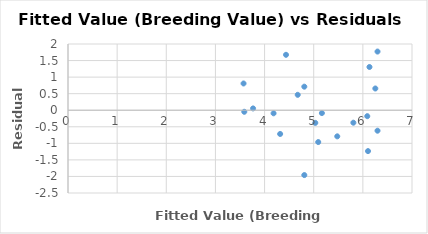
| Category | residual (y-yest) |
|---|---|
| 5.806840272404171 | -0.377 |
| 3.5871606789335626 | -0.047 |
| 4.674654707949363 | 0.465 |
| 4.317122424437319 | -0.717 |
| 6.298447162233232 | 1.772 |
| 6.253755626794225 | 0.656 |
| 5.1662615977784245 | -0.086 |
| 5.0917757053800825 | -0.962 |
| 5.032186991461408 | -0.382 |
| 6.134578198956878 | 1.305 |
| 4.8087293142663805 | -1.959 |
| 4.436299852274668 | 1.674 |
| 4.8087293142663805 | 0.711 |
| 3.5722635004538943 | 0.808 |
| 3.7659268206895846 | 0.054 |
| 6.298447162233232 | -0.618 |
| 5.479102345851464 | -0.789 |
| 4.183047818120303 | -0.093 |
| 6.089886663517873 | -0.18 |
| 6.104783841997541 | -1.235 |